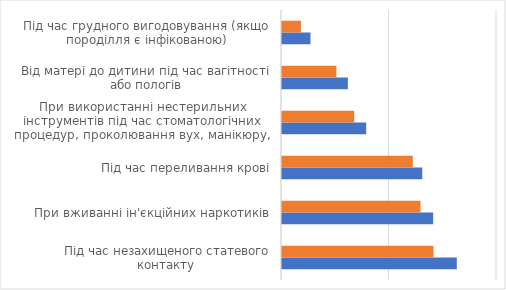
| Category | Series 0 | Series 1 |
|---|---|---|
| Під час незахищеного статевого контакту  | 0.813 | 0.705 |
| При вживанні ін'єкційних наркотиків | 0.703 | 0.644 |
| Під час переливання крові | 0.652 | 0.608 |
| При використанні нестерильних інструментів під час стоматологічних процедур, проколювання вух, манікюру, нанесення тату тощо | 0.392 | 0.336 |
| Від матері до дитини під час вагітності або пологів | 0.306 | 0.253 |
| Під час грудного вигодовування (якщо породілля є інфікованою) | 0.133 | 0.088 |